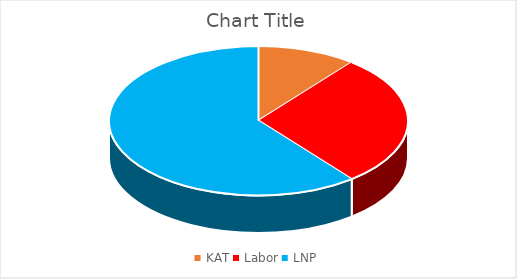
| Category | Series 0 |
|---|---|
| KAT | 3 |
| Labor | 8 |
| LNP | 17 |